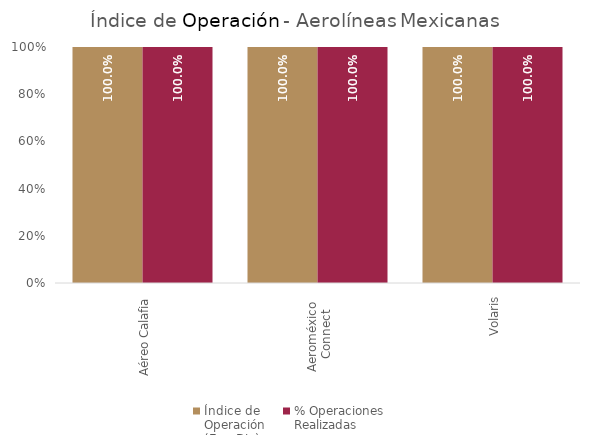
| Category | Índice de 
Operación
(Ene-Dic) | % Operaciones
Realizadas |
|---|---|---|
| Aéreo Calafia | 1 | 1 |
| Aeroméxico 
Connect | 1 | 1 |
| Volaris | 1 | 1 |